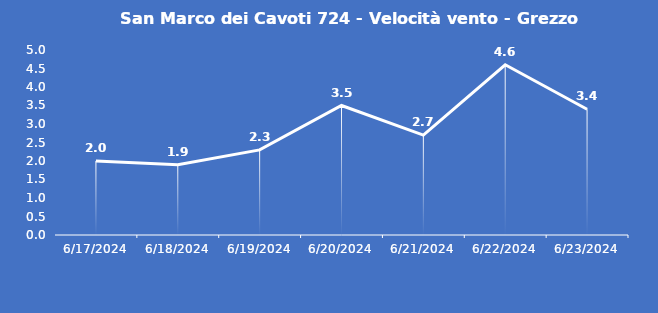
| Category | San Marco dei Cavoti 724 - Velocità vento - Grezzo (m/s) |
|---|---|
| 6/17/24 | 2 |
| 6/18/24 | 1.9 |
| 6/19/24 | 2.3 |
| 6/20/24 | 3.5 |
| 6/21/24 | 2.7 |
| 6/22/24 | 4.6 |
| 6/23/24 | 3.4 |